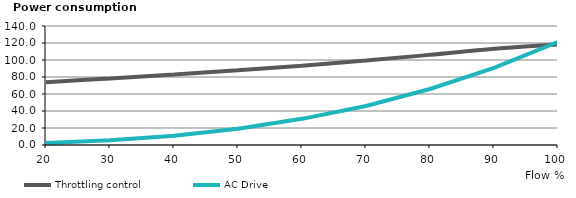
| Category | Throttling control | AC Drive  |
|---|---|---|
| 20.0 | 73.876 | 2.36 |
| 30.0 | 78.281 | 5.511 |
| 40.0 | 82.949 | 10.851 |
| 50.0 | 87.948 | 19.101 |
| 60.0 | 93.371 | 30.779 |
| 70.0 | 99.351 | 45.966 |
| 80.0 | 106.078 | 65.921 |
| 90.0 | 113.119 | 90.844 |
| 100.0 | 118.202 | 121.233 |